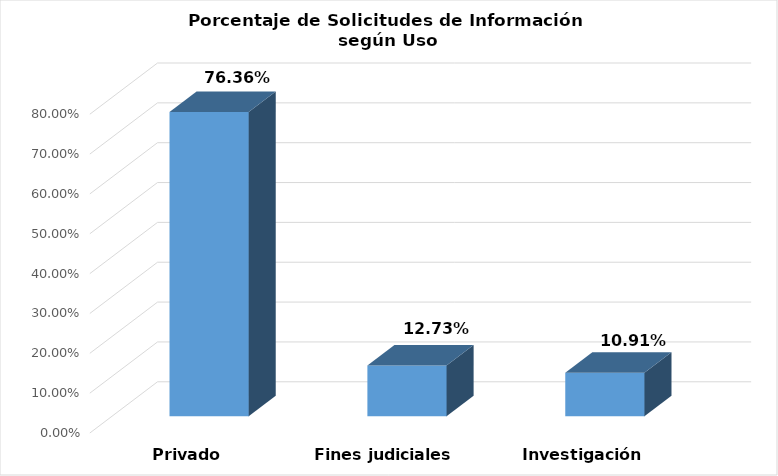
| Category | Series 0 |
|---|---|
| Privado | 0.764 |
| Fines judiciales | 0.127 |
| Investigación | 0.109 |